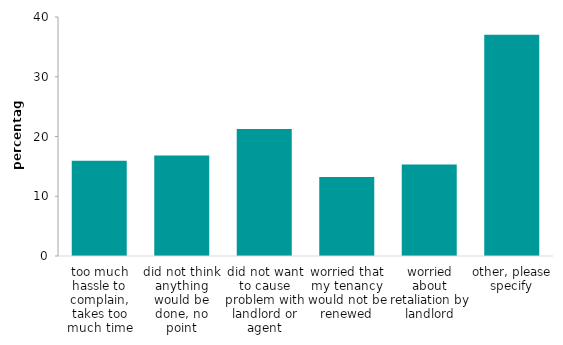
| Category | private renters |
|---|---|
| too much hassle to complain, takes too much time | 15.929 |
| did not think anything would be done, no point | 16.835 |
| did not want to cause problem with landlord or agent | 21.25 |
| worried that my tenancy would not be renewed | 13.232 |
| worried about retaliation by landlord | 15.323 |
| other, please specify | 37.037 |